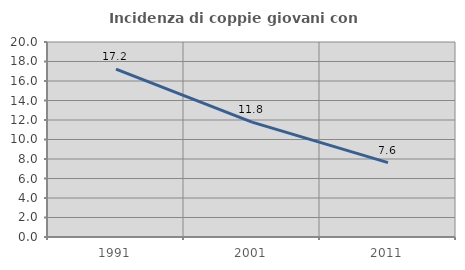
| Category | Incidenza di coppie giovani con figli |
|---|---|
| 1991.0 | 17.221 |
| 2001.0 | 11.782 |
| 2011.0 | 7.627 |